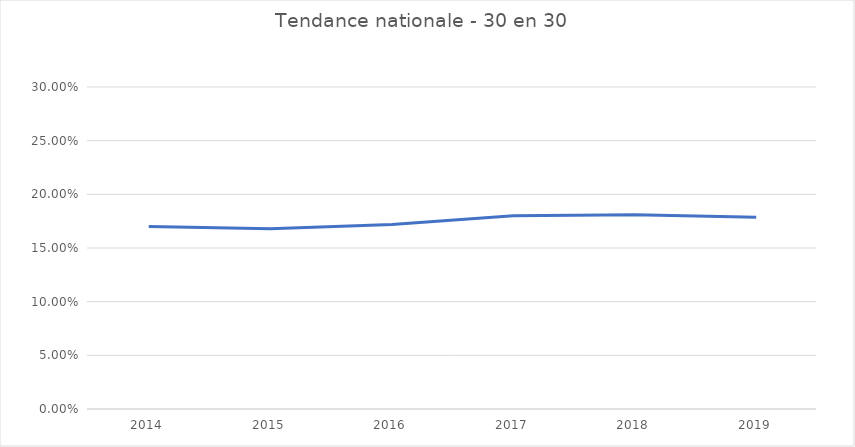
| Category |  Pourcentage national -              30 en 30   |
|---|---|
| 2014.0 | 0.17 |
| 2015.0 | 0.168 |
| 2016.0 | 0.172 |
| 2017.0 | 0.18 |
| 2018.0 | 0.181 |
| 2019.0 | 0.179 |